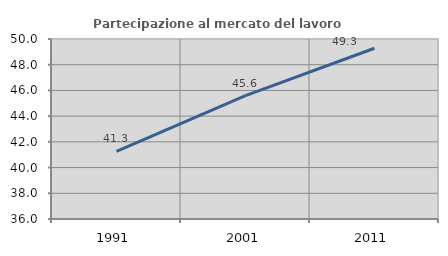
| Category | Partecipazione al mercato del lavoro  femminile |
|---|---|
| 1991.0 | 41.252 |
| 2001.0 | 45.602 |
| 2011.0 | 49.278 |